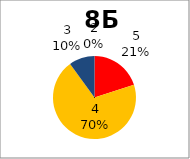
| Category | Series 0 |
|---|---|
| 5.0 | 2 |
| 4.0 | 7 |
| 3.0 | 1 |
| 2.0 | 0 |